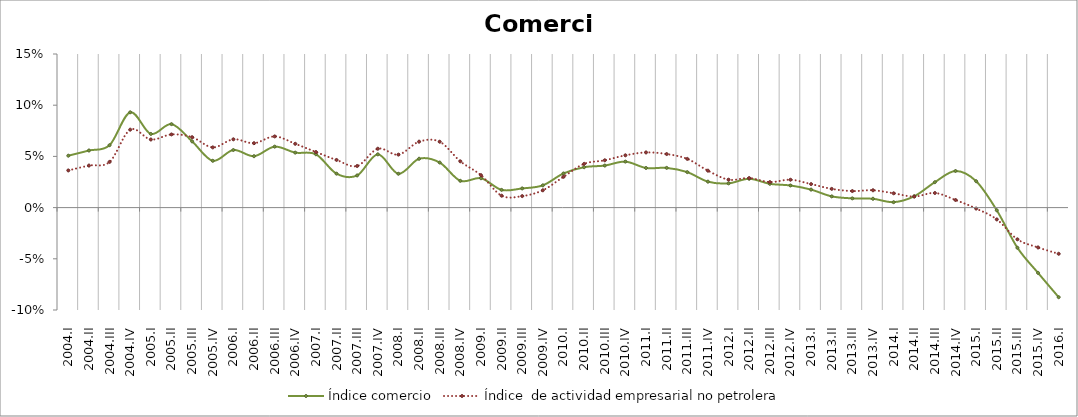
| Category | Índice comercio | Índice  de actividad empresarial no petrolera |
|---|---|---|
| 2004.I | 0.051 | 0.036 |
| 2004.II | 0.056 | 0.041 |
| 2004.III | 0.061 | 0.045 |
| 2004.IV | 0.093 | 0.076 |
| 2005.I | 0.072 | 0.066 |
| 2005.II | 0.082 | 0.071 |
| 2005.III | 0.065 | 0.069 |
| 2005.IV | 0.046 | 0.059 |
| 2006.I | 0.056 | 0.067 |
| 2006.II | 0.05 | 0.063 |
| 2006.III | 0.06 | 0.07 |
| 2006.IV | 0.054 | 0.062 |
| 2007.I | 0.052 | 0.054 |
| 2007.II | 0.033 | 0.047 |
| 2007.III | 0.031 | 0.041 |
| 2007.IV | 0.052 | 0.057 |
| 2008.I | 0.033 | 0.052 |
| 2008.II | 0.048 | 0.064 |
| 2008.III | 0.044 | 0.064 |
| 2008.IV | 0.026 | 0.045 |
| 2009.I | 0.029 | 0.032 |
| 2009.II | 0.017 | 0.012 |
| 2009.III | 0.019 | 0.011 |
| 2009.IV | 0.022 | 0.017 |
| 2010.I | 0.033 | 0.03 |
| 2010.II | 0.039 | 0.043 |
| 2010.III | 0.041 | 0.046 |
| 2010.IV | 0.045 | 0.051 |
| 2011.I | 0.039 | 0.054 |
| 2011.II | 0.039 | 0.052 |
| 2011.III | 0.035 | 0.048 |
| 2011.IV | 0.025 | 0.036 |
| 2012.I | 0.024 | 0.027 |
| 2012.II | 0.028 | 0.029 |
| 2012.III | 0.023 | 0.025 |
| 2012.IV | 0.022 | 0.027 |
| 2013.I | 0.018 | 0.023 |
| 2013.II | 0.011 | 0.018 |
| 2013.III | 0.009 | 0.016 |
| 2013.IV | 0.009 | 0.017 |
| 2014.I | 0.005 | 0.014 |
| 2014.II | 0.011 | 0.011 |
| 2014.III | 0.025 | 0.014 |
| 2014.IV | 0.036 | 0.007 |
| 2015.I | 0.026 | -0.001 |
| 2015.II | -0.003 | -0.012 |
| 2015.III | -0.039 | -0.031 |
| 2015.IV | -0.064 | -0.039 |
| 2016.I | -0.087 | -0.045 |